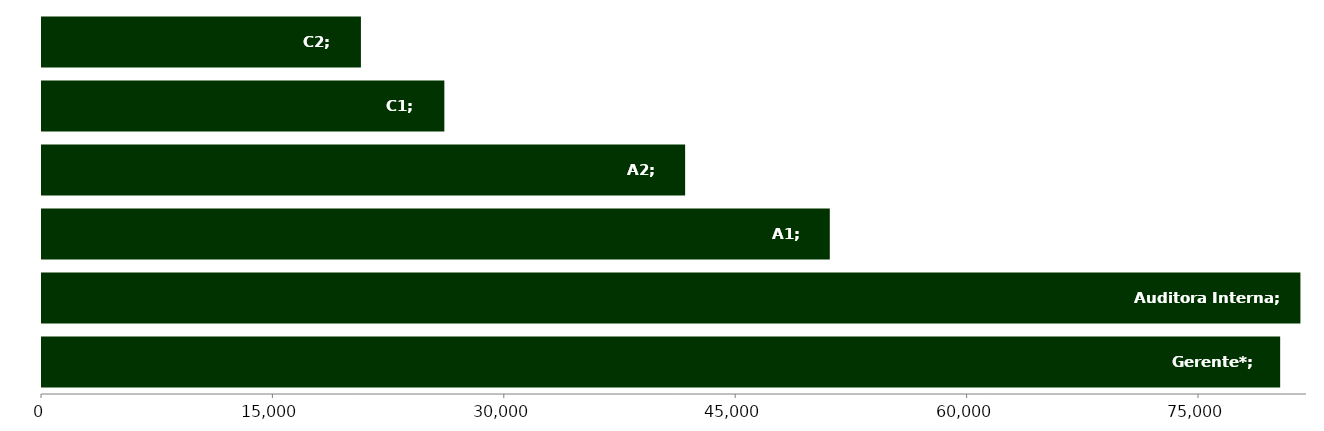
| Category | Series 3 |
|---|---|
| Gerente* | 80260.76 |
| Auditora Interna | 81573.57 |
| A1 | 51066.944 |
| A2 | 41689.283 |
| C1 | 26081.35 |
| C2 | 20673.034 |